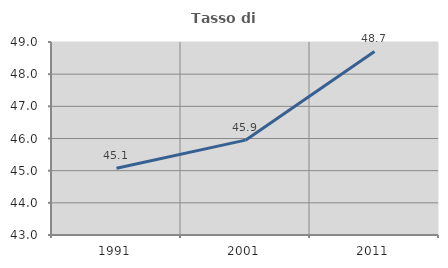
| Category | Tasso di occupazione   |
|---|---|
| 1991.0 | 45.077 |
| 2001.0 | 45.949 |
| 2011.0 | 48.707 |